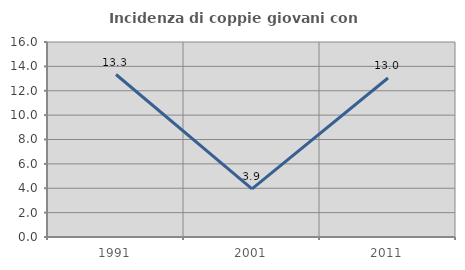
| Category | Incidenza di coppie giovani con figli |
|---|---|
| 1991.0 | 13.333 |
| 2001.0 | 3.947 |
| 2011.0 | 13.043 |